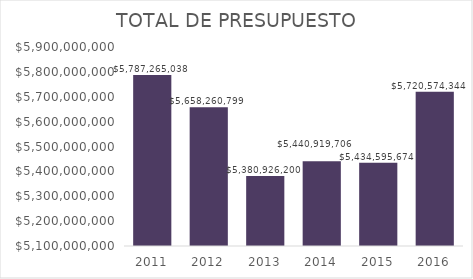
| Category | TOTAL DE PRESUPUESTO |
|---|---|
| 2011.0 | 5787265038 |
| 2012.0 | 5658260799 |
| 2013.0 | 5380926200 |
| 2014.0 | 5440919705.74 |
| 2015.0 | 5434595674 |
| 2016.0 | 5720574344 |